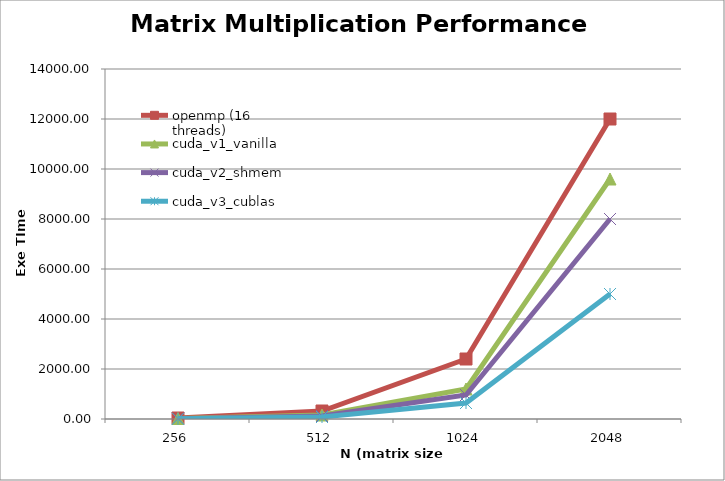
| Category | openmp (16 threads) | cuda_v1_vanilla | cuda_v2_shmem | cuda_v3_cublas |
|---|---|---|---|---|
| 256.0 | 40 | 20 | 15 | 10 |
| 512.0 | 320 | 160 | 120 | 80 |
| 1024.0 | 2400 | 1200 | 960 | 640 |
| 2048.0 | 12000 | 9600 | 8000 | 5000 |